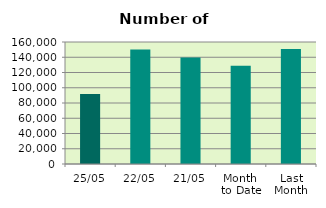
| Category | Series 0 |
|---|---|
| 25/05 | 91876 |
| 22/05 | 150016 |
| 21/05 | 139812 |
| Month 
to Date | 128939.125 |
| Last
Month | 150855.6 |